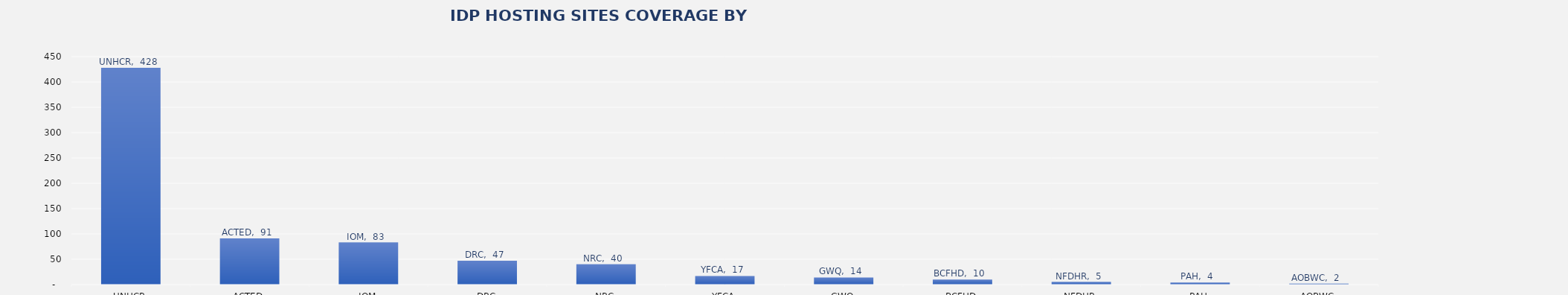
| Category | Total |
|---|---|
| UNHCR | 428 |
| ACTED | 91 |
| IOM | 83 |
| DRC | 47 |
| NRC | 40 |
| YFCA | 17 |
| GWQ | 14 |
| BCFHD | 10 |
| NFDHR | 5 |
| PAH | 4 |
| AOBWC | 2 |